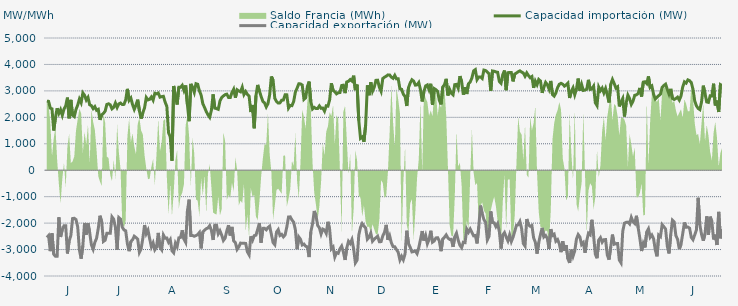
| Category | Capacidad importación (MW) | Capacidad exportación (MW) |
|---|---|---|
| 0 | 2613.333 | -2542.833 |
| 1900-01-01 | 2604.917 | -2471 |
| 1900-01-02 | 2348.667 | -3059.875 |
| 1900-01-03 | 2320.833 | -2387.5 |
| 1900-01-04 | 1502.083 | -3177.542 |
| 1900-01-05 | 1981.25 | -3254.458 |
| 1900-01-06 | 2343.208 | -3252.458 |
| 1900-01-07 | 2147.917 | -1780 |
| 1900-01-08 | 2287.5 | -2525 |
| 1900-01-09 | 2076.167 | -2245.833 |
| 1900-01-10 | 2310.167 | -2100 |
| 1900-01-11 | 2432.875 | -2100 |
| 1900-01-12 | 2745.667 | -3148.25 |
| 1900-01-13 | 1962.5 | -2676.167 |
| 1900-01-14 | 2660.917 | -2469.583 |
| 1900-01-15 | 2079.167 | -1827.083 |
| 1900-01-16 | 2027.083 | -1816.667 |
| 1900-01-17 | 2300 | -1864.583 |
| 1900-01-18 | 2462.5 | -2143.75 |
| 1900-01-19 | 2691.458 | -3018.958 |
| 1900-01-20 | 2552.792 | -3345.333 |
| 1900-01-21 | 2923.125 | -2854.917 |
| 1900-01-22 | 2833.042 | -1993.167 |
| 1900-01-23 | 2653.792 | -2436 |
| 1900-01-24 | 2753.958 | -1999.792 |
| 1900-01-25 | 2473.333 | -2362.833 |
| 1900-01-26 | 2441.667 | -2824.792 |
| 1900-01-27 | 2328.458 | -2988.458 |
| 1900-01-28 | 2403.5 | -2728.542 |
| 1900-01-29 | 2265.917 | -2574.25 |
| 1900-01-30 | 2301.833 | -2201.042 |
| 1900-01-31 | 1903.333 | -1720.833 |
| 1900-02-01 | 2094.667 | -1947.917 |
| 1900-02-02 | 2147.917 | -2694.292 |
| 1900-02-03 | 2232.083 | -2646 |
| 1900-02-04 | 2487.5 | -2387.5 |
| 1900-02-05 | 2512.5 | -2387.5 |
| 1900-02-06 | 2472.917 | -2387.5 |
| 1900-02-07 | 2322 | -1764.625 |
| 1900-02-08 | 2377.5 | -1853.5 |
| 1900-02-09 | 2540.458 | -2160.917 |
| 1900-02-10 | 2372.875 | -3004.125 |
| 1900-02-11 | 2508.625 | -1791.125 |
| 1900-02-12 | 2539.208 | -1849.75 |
| 1900-02-13 | 2483.208 | -2155.417 |
| 1900-02-14 | 2490.375 | -2256.75 |
| 1900-02-15 | 2658.333 | -2291.667 |
| 1900-02-16 | 3076.5 | -2786.667 |
| 1900-02-17 | 2645.958 | -3061.667 |
| 1900-02-18 | 2731.458 | -2699.25 |
| 1900-02-19 | 2480.417 | -2627.458 |
| 1900-02-20 | 2300.833 | -2495 |
| 1900-02-21 | 2461.958 | -2546.167 |
| 1900-02-22 | 2667.458 | -2604.875 |
| 1900-02-23 | 2250.333 | -3105.542 |
| 1900-02-24 | 1952.083 | -2970.875 |
| 1900-02-25 | 2172 | -2579.417 |
| 1900-02-26 | 2356.083 | -2071.833 |
| 1900-02-27 | 2750.708 | -2400.667 |
| 1900-02-28 | 2658.875 | -2268.083 |
| 1900-02-28 | 2681 | -2596.625 |
| 1900-03-01 | 2770.75 | -2898.375 |
| 1900-03-02 | 2648.75 | -2746.625 |
| 1900-03-03 | 2910.167 | -3009.083 |
| 1900-03-04 | 2888.542 | -2911.458 |
| 1900-03-05 | 2919.917 | -2370.542 |
| 1900-03-06 | 2763.333 | -2914.917 |
| 1900-03-07 | 2782.917 | -3008.083 |
| 1900-03-08 | 2795.542 | -2448.708 |
| 1900-03-09 | 2576.25 | -2572.292 |
| 1900-03-10 | 2415.583 | -2563.292 |
| 1900-03-11 | 1418.917 | -2723.958 |
| 1900-03-12 | 1264.583 | -2622.458 |
| 1900-03-13 | 358.333 | -3044.542 |
| 1900-03-14 | 3186.917 | -3120.333 |
| 1900-03-15 | 2791.875 | -2763.458 |
| 1900-03-16 | 2484.583 | -2895.958 |
| 1900-03-17 | 3137.583 | -2556.25 |
| 1900-03-18 | 3137.5 | -2540.875 |
| 1900-03-19 | 3211 | -2273.125 |
| 1900-03-20 | 3012.542 | -2608.417 |
| 1900-03-21 | 3204.542 | -2728.708 |
| 1900-03-22 | 2487.333 | -1541.875 |
| 1900-03-23 | 1853.333 | -1112.917 |
| 1900-03-24 | 3263.917 | -2468.833 |
| 1900-03-25 | 3130.375 | -2468.375 |
| 1900-03-26 | 2944.542 | -2498.083 |
| 1900-03-27 | 3271.625 | -2470.667 |
| 1900-03-28 | 3250.667 | -2433.5 |
| 1900-03-29 | 3002.292 | -2354.917 |
| 1900-03-30 | 2842.625 | -2955.417 |
| 1900-03-31 | 2513.542 | -2337.375 |
| 1900-04-01 | 2375 | -2269.958 |
| 1900-04-02 | 2218.75 | -2210.458 |
| 1900-04-03 | 2093.75 | -2184.542 |
| 1900-04-04 | 2002.083 | -2097.042 |
| 1900-04-05 | 2264.583 | -2273.583 |
| 1900-04-06 | 2866.875 | -2637 |
| 1900-04-07 | 2346.958 | -2079.75 |
| 1900-04-08 | 2329.625 | -2082.083 |
| 1900-04-09 | 2302.458 | -2405.417 |
| 1900-04-10 | 2617.333 | -2289.667 |
| 1900-04-11 | 2750.042 | -2452.833 |
| 1900-04-12 | 2809.125 | -2657.958 |
| 1900-04-13 | 2857.375 | -2569.75 |
| 1900-04-14 | 2876.833 | -2291.708 |
| 1900-04-15 | 2750.708 | -2082.833 |
| 1900-04-16 | 2747.333 | -2466.667 |
| 1900-04-17 | 2937.458 | -2144.25 |
| 1900-04-18 | 3062.458 | -2672.417 |
| 1900-04-19 | 2740.417 | -2737.792 |
| 1900-04-20 | 3040.542 | -2994.125 |
| 1900-04-21 | 2995.708 | -2899.083 |
| 1900-04-22 | 2964.458 | -2754.583 |
| 1900-04-23 | 3138.792 | -2763.917 |
| 1900-04-24 | 2861.083 | -2758.667 |
| 1900-04-25 | 2973.75 | -2769.708 |
| 1900-04-26 | 2865 | -3086.792 |
| 1900-04-27 | 2805.417 | -3199.875 |
| 1900-04-28 | 2200 | -2500 |
| 1900-04-29 | 2468.25 | -2649 |
| 1900-04-30 | 1587.5 | -2475 |
| 1900-05-01 | 2818.542 | -2455.458 |
| 1900-05-02 | 3225.708 | -2239.583 |
| 1900-05-03 | 3000 | -2000 |
| 1900-05-04 | 2791.958 | -2738.25 |
| 1900-05-05 | 2607.167 | -2198.667 |
| 1900-05-06 | 2547.125 | -2197 |
| 1900-05-07 | 2393.292 | -2255.25 |
| 1900-05-08 | 2516 | -2169.167 |
| 1900-05-09 | 2853.667 | -2114.625 |
| 1900-05-10 | 3545.458 | -2428.042 |
| 1900-05-11 | 3402.833 | -2737.792 |
| 1900-05-12 | 2716.792 | -2816.833 |
| 1900-05-13 | 2599.417 | -2338.083 |
| 1900-05-14 | 2539.208 | -2246.333 |
| 1900-05-15 | 2547.375 | -2467.5 |
| 1900-05-16 | 2645.583 | -2424.333 |
| 1900-05-17 | 2654.167 | -2520.833 |
| 1900-05-18 | 2852.417 | -2448.375 |
| 1900-05-19 | 2850 | -2144.833 |
| 1900-05-20 | 2350 | -1768.75 |
| 1900-05-21 | 2450 | -1762.5 |
| 1900-05-22 | 2441.667 | -1881.25 |
| 1900-05-23 | 2597.917 | -1964.583 |
| 1900-05-24 | 2954.167 | -2250 |
| 1900-05-25 | 3102.32 | -2983.84 |
| 1900-05-26 | 3270.125 | -2524.167 |
| 1900-05-27 | 3263.958 | -2613.375 |
| 1900-05-28 | 3221.25 | -2826.5 |
| 1900-05-29 | 2678.333 | -2792.5 |
| 1900-05-30 | 2739.75 | -2875.042 |
| 1900-05-31 | 3161.75 | -2895.917 |
| 1900-06-01 | 3353.167 | -3283.208 |
| 1900-06-02 | 2604.75 | -2336.125 |
| 1900-06-03 | 2316.667 | -2037.25 |
| 1900-06-04 | 2377.083 | -1541.667 |
| 1900-06-05 | 2335.417 | -1708.333 |
| 1900-06-06 | 2333.083 | -2087.5 |
| 1900-06-07 | 2432.958 | -2175.833 |
| 1900-06-08 | 2341.417 | -2411.458 |
| 1900-06-09 | 2350 | -2224.167 |
| 1900-06-10 | 2233.333 | -2255.875 |
| 1900-06-11 | 2436.333 | -2388.333 |
| 1900-06-12 | 2422.917 | -1949.75 |
| 1900-06-13 | 2664.167 | -2243.25 |
| 1900-06-14 | 3289.125 | -2974.875 |
| 1900-06-15 | 3022.042 | -2905.375 |
| 1900-06-16 | 2967.917 | -3281.292 |
| 1900-06-17 | 2888.083 | -3117.75 |
| 1900-06-18 | 2932.458 | -3142.792 |
| 1900-06-19 | 2934.917 | -2973.208 |
| 1900-06-20 | 3202.583 | -2869.458 |
| 1900-06-21 | 3215.75 | -3094.417 |
| 1900-06-22 | 2915.5 | -3393.375 |
| 1900-06-23 | 3338.625 | -2938.583 |
| 1900-06-24 | 3362.542 | -2687.333 |
| 1900-06-25 | 3428.958 | -2770.5 |
| 1900-06-26 | 3372 | -2622.5 |
| 1900-06-27 | 3574.375 | -2972.542 |
| 1900-06-28 | 3028.917 | -3504.875 |
| 1900-06-29 | 3239.167 | -3400.917 |
| 1900-06-30 | 1878.75 | -2447.25 |
| 1900-07-01 | 1204.167 | -2164.583 |
| 1900-07-02 | 1258.333 | -2018.75 |
| 1900-07-03 | 1077.083 | -2108.333 |
| 1900-07-04 | 1711.917 | -2183.333 |
| 1900-07-05 | 3210.167 | -2609.5 |
| 1900-07-06 | 2835.417 | -2533.333 |
| 1900-07-07 | 3323.833 | -2378.417 |
| 1900-07-08 | 2986.708 | -2684.958 |
| 1900-07-09 | 3136.75 | -2609.25 |
| 1900-07-10 | 3398.958 | -2552.333 |
| 1900-07-11 | 3404.708 | -2496.458 |
| 1900-07-12 | 3136.792 | -2703.625 |
| 1900-07-13 | 2984.417 | -2700 |
| 1900-07-14 | 3466.5 | -2483.792 |
| 1900-07-15 | 3518.5 | -2345.833 |
| 1900-07-16 | 3555.167 | -2067 |
| 1900-07-17 | 3605.208 | -2635.583 |
| 1900-07-18 | 3603.083 | -2480.625 |
| 1900-07-19 | 3517.167 | -2743.458 |
| 1900-07-20 | 3473.958 | -2890.375 |
| 1900-07-21 | 3587.875 | -2893.625 |
| 1900-07-22 | 3454.583 | -3000.667 |
| 1900-07-23 | 3456.875 | -3104.042 |
| 1900-07-24 | 3080.708 | -3395.083 |
| 1900-07-25 | 3059.792 | -3254.417 |
| 1900-07-26 | 2872.417 | -3385.667 |
| 1900-07-27 | 2791.792 | -3162.083 |
| 1900-07-28 | 2427.708 | -2287.5 |
| 1900-07-29 | 3123.125 | -2773 |
| 1900-07-30 | 3298.917 | -2914.542 |
| 1900-07-31 | 3420.292 | -3090.167 |
| 1900-08-01 | 3370.083 | -3074.542 |
| 1900-08-02 | 3217.542 | -3055.958 |
| 1900-08-03 | 3229.292 | -3154.333 |
| 1900-08-04 | 3317 | -2928.75 |
| 1900-08-05 | 3040.5 | -2617.875 |
| 1900-08-06 | 2600 | -2300 |
| 1900-08-07 | 2973.125 | -2658.375 |
| 1900-08-08 | 3188.5 | -2468 |
| 1900-08-09 | 3225.417 | -2780.667 |
| 1900-08-10 | 3042.292 | -2615.25 |
| 1900-08-11 | 3269.292 | -2289.5 |
| 1900-08-12 | 2466.917 | -2722.042 |
| 1900-08-13 | 3087.042 | -2676.583 |
| 1900-08-14 | 3046.125 | -2559.917 |
| 1900-08-15 | 2981.833 | -2552.167 |
| 1900-08-16 | 2640.875 | -2681.583 |
| 1900-08-17 | 2488.417 | -3061.75 |
| 1900-08-18 | 3148 | -2596.625 |
| 1900-08-19 | 3235.333 | -2534.25 |
| 1900-08-20 | 3454.833 | -2446.292 |
| 1900-08-21 | 2826.208 | -2562.5 |
| 1900-08-22 | 3055.625 | -2616 |
| 1900-08-23 | 2910.667 | -2614.333 |
| 1900-08-24 | 2851.625 | -2898.833 |
| 1900-08-25 | 3236.792 | -2519.125 |
| 1900-08-26 | 3247.417 | -2381.958 |
| 1900-08-27 | 3102.208 | -2645.667 |
| 1900-08-28 | 3559.042 | -2840.083 |
| 1900-08-29 | 3354.708 | -2929.5 |
| 1900-08-30 | 2857.208 | -2721.292 |
| 1900-08-31 | 3142.708 | -2736.667 |
| 1900-09-01 | 2882.458 | -2227.083 |
| 1900-09-02 | 3271.833 | -2344.333 |
| 1900-09-03 | 3337.5 | -2224.542 |
| 1900-09-04 | 3489.625 | -2354.917 |
| 1900-09-05 | 3757.5 | -2480.083 |
| 1900-09-06 | 3803.5 | -2467.75 |
| 1900-09-07 | 3425.167 | -2769.083 |
| 1900-09-08 | 3524.417 | -2147.917 |
| 1900-09-09 | 3527.917 | -1337.5 |
| 1900-09-10 | 3470.417 | -1637.5 |
| 1900-09-11 | 3786.25 | -1866.667 |
| 1900-09-12 | 3770.917 | -1970.833 |
| 1900-09-13 | 3709.083 | -2634.458 |
| 1900-09-14 | 3643.708 | -2500.125 |
| 1900-09-15 | 3002.833 | -1558.333 |
| 1900-09-16 | 3753.5 | -1977.083 |
| 1900-09-17 | 3742 | -1987.792 |
| 1900-09-18 | 3717 | -2132.708 |
| 1900-09-19 | 3703.5 | -2019.625 |
| 1900-09-20 | 3356.5 | -2318.75 |
| 1900-09-21 | 3287.25 | -2961.542 |
| 1900-09-22 | 3613 | -2448.25 |
| 1900-09-23 | 3770.917 | -2358.208 |
| 1900-09-24 | 3026.833 | -2529 |
| 1900-09-25 | 3690.125 | -2672.167 |
| 1900-09-26 | 3691.917 | -2447.375 |
| 1900-09-27 | 3691.917 | -2696.25 |
| 1900-09-28 | 3359.625 | -2533.208 |
| 1900-09-29 | 3638.208 | -2312.042 |
| 1900-09-30 | 3676.542 | -2081.625 |
| 1900-10-01 | 3724.917 | -2066.75 |
| 1900-10-02 | 3757.5 | -1941.667 |
| 1900-10-03 | 3711.333 | -2204.125 |
| 1900-10-04 | 3675.458 | -2771.042 |
| 1900-10-05 | 3554.458 | -2867.542 |
| 1900-10-06 | 3680.333 | -1844.583 |
| 1900-10-07 | 3578.458 | -2062.333 |
| 1900-10-08 | 3498.667 | -2120.125 |
| 1900-10-09 | 3542.583 | -2088.25 |
| 1900-10-10 | 3116.583 | -2558.083 |
| 1900-10-11 | 3368.333 | -2721.125 |
| 1900-10-12 | 3235.167 | -3154.375 |
| 1900-10-13 | 3431.792 | -2737.167 |
| 1900-10-14 | 3373.458 | -2436.25 |
| 1900-10-15 | 2927.625 | -2181.583 |
| 1900-10-16 | 3136.625 | -2524.417 |
| 1900-10-17 | 3321.958 | -2467.708 |
| 1900-10-18 | 3237.167 | -2582.667 |
| 1900-10-19 | 3067.667 | -2979.292 |
| 1900-10-20 | 3375.875 | -2228.75 |
| 1900-10-21 | 2860.583 | -2468.833 |
| 1900-10-22 | 2803.375 | -2421.417 |
| 1900-10-23 | 2924.833 | -2685.667 |
| 1900-10-24 | 3128.125 | -2622.333 |
| 1900-10-25 | 3249.042 | -2786 |
| 1900-10-26 | 3285.957 | -3098.435 |
| 1900-10-27 | 3251.125 | -2683.875 |
| 1900-10-28 | 3179.958 | -3042.333 |
| 1900-10-29 | 3227.792 | -2833.458 |
| 1900-10-30 | 3292.833 | -3348.958 |
| 1900-10-31 | 2730.667 | -3504.917 |
| 1900-11-01 | 2985 | -3005.417 |
| 1900-11-02 | 3117.458 | -3250.417 |
| 1900-11-03 | 2855.083 | -3052.042 |
| 1900-11-04 | 3069.458 | -2602.292 |
| 1900-11-05 | 3466.417 | -2432.792 |
| 1900-11-06 | 3007.167 | -2522.875 |
| 1900-11-07 | 3244.375 | -2811.167 |
| 1900-11-08 | 3017.708 | -2737.208 |
| 1900-11-09 | 3032.833 | -3121.625 |
| 1900-11-10 | 3065.708 | -2665.083 |
| 1900-11-11 | 3418.292 | -2382.667 |
| 1900-11-12 | 3056.792 | -2438.792 |
| 1900-11-13 | 3079.167 | -1874.583 |
| 1900-11-14 | 3179.375 | -2471.917 |
| 1900-11-15 | 2552.25 | -3173.583 |
| 1900-11-16 | 2444.667 | -3327.792 |
| 1900-11-17 | 3144.958 | -2640.625 |
| 1900-11-18 | 3010.208 | -2550.208 |
| 1900-11-19 | 3107.125 | -2722.583 |
| 1900-11-20 | 2923.625 | -2627.417 |
| 1900-11-21 | 3090.583 | -2621.917 |
| 1900-11-22 | 2846.083 | -3210.25 |
| 1900-11-23 | 2560.75 | -3379.792 |
| 1900-11-24 | 3251.25 | -2896.042 |
| 1900-11-25 | 3432.333 | -2434.75 |
| 1900-11-26 | 3283.375 | -2799.542 |
| 1900-11-27 | 3108.792 | -2777.042 |
| 1900-11-28 | 3154.917 | -2772.25 |
| 1900-11-29 | 2413.25 | -3395.792 |
| 1900-11-30 | 2576 | -3503 |
| 1900-12-01 | 2711.917 | -2310.333 |
| 1900-12-02 | 2031.25 | -2002.083 |
| 1900-12-03 | 2544.667 | -1970.833 |
| 1900-12-04 | 2838.208 | -1962.5 |
| 1900-12-05 | 2706.708 | -2031.25 |
| 1900-12-06 | 2490.375 | -1785.417 |
| 1900-12-07 | 2612.792 | -1947.333 |
| 1900-12-08 | 2833 | -2014.333 |
| 1900-12-09 | 2851.583 | -1722.917 |
| 1900-12-10 | 2901.75 | -2171.25 |
| 1900-12-11 | 3113.667 | -2582.042 |
| 1900-12-12 | 2787.083 | -3055.958 |
| 1900-12-13 | 3331.625 | -2767.125 |
| 1900-12-14 | 3347 | -2920.625 |
| 1900-12-15 | 3277.833 | -2334.375 |
| 1900-12-16 | 3547.333 | -2216.875 |
| 1900-12-17 | 3127.583 | -2536.667 |
| 1900-12-18 | 3182.75 | -2450.958 |
| 1900-12-19 | 2868.792 | -2589.917 |
| 1900-12-20 | 2696.25 | -3016.542 |
| 1900-12-21 | 2758.458 | -3256.458 |
| 1900-12-22 | 2820.083 | -2452.083 |
| 1900-12-23 | 2874.792 | -2511.083 |
| 1900-12-24 | 3131.542 | -2059.125 |
| 1900-12-25 | 3205.375 | -2136.25 |
| 1900-12-26 | 3253.375 | -2224.125 |
| 1900-12-27 | 3057.042 | -2870.958 |
| 1900-12-28 | 2876.042 | -3146.333 |
| 1900-12-29 | 3076.708 | -2437.5 |
| 1900-12-30 | 2714.417 | -1890.667 |
| 1900-12-31 | 2675.25 | -1952.042 |
| 1901-01-01 | 2712.625 | -2473.333 |
| 1901-01-02 | 2762.542 | -2608.917 |
| 1901-01-03 | 2652 | -2984.583 |
| 1901-01-04 | 2806.792 | -2803.333 |
| 1901-01-05 | 3151.167 | -2401.458 |
| 1901-01-06 | 3341.792 | -1976.417 |
| 1901-01-07 | 3295.083 | -2154.25 |
| 1901-01-08 | 3415.542 | -2148.458 |
| 1901-01-09 | 3386.458 | -2191.625 |
| 1901-01-10 | 3315.833 | -2538.333 |
| 1901-01-11 | 3059.75 | -2627.417 |
| 1901-01-12 | 2619.042 | -2445.958 |
| 1901-01-13 | 2434.542 | -2258.708 |
| 1901-01-14 | 2336.958 | -1043.75 |
| 1901-01-15 | 2291.5 | -2066.667 |
| 1901-01-16 | 2591.375 | -2432.417 |
| 1901-01-17 | 3198.167 | -2666.208 |
| 1901-01-18 | 2894.833 | -2404.875 |
| 1901-01-19 | 2582.208 | -1743.542 |
| 1901-01-20 | 2566.333 | -2434.875 |
| 1901-01-21 | 2811.458 | -1757.708 |
| 1901-01-22 | 2808 | -1938.167 |
| 1901-01-23 | 3272.083 | -2618.542 |
| 1901-01-24 | 2447.208 | -2437.333 |
| 1901-01-25 | 2633.208 | -2826.667 |
| 1901-01-26 | 2202.083 | -1575 |
| 1901-01-27 | 3237.583 | -2574.625 |
| 1901-01-28 | 3201.042 | -2230.542 |